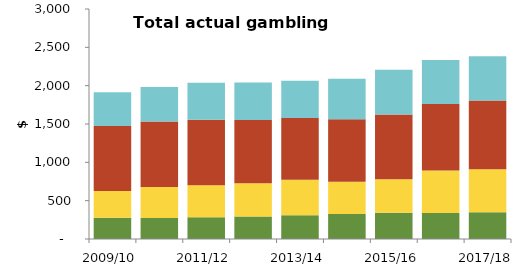
| Category | NZ Racing Board (TAB) | NZ Lotteries Commission | Gaming machines (outside casinos) | Casinos |
|---|---|---|---|---|
| 2009/10 | 278.393 | 346.622 | 849.163 | 439.795 |
| 2010/11 | 272.793 | 404.477 | 856.099 | 448.337 |
| 2011/12 | 282.951 | 418.739 | 853.954 | 482.662 |
| 2012/13 | 294.285 | 431.824 | 826.779 | 489.573 |
| 2013/14 | 310.171 | 463.06 | 806.271 | 485.655 |
| 2014/15 | 325.051 | 420.377 | 818.113 | 527.104 |
| 2015/16 | 342.291 | 437.262 | 843.483 | 585.622 |
| 2016/17 | 337.735 | 554.651 | 869.91 | 571.568 |
| 2017/18 | 349.868 | 560.611 | 894.936 | 577.899 |